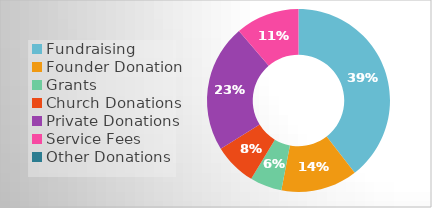
| Category | Series 0 |
|---|---|
| Fundraising | 0.395 |
| Founder Donation | 0.135 |
| Grants | 0.056 |
| Church Donations | 0.075 |
| Private Donations | 0.226 |
| Service Fees | 0.113 |
| Other Donations | 0 |